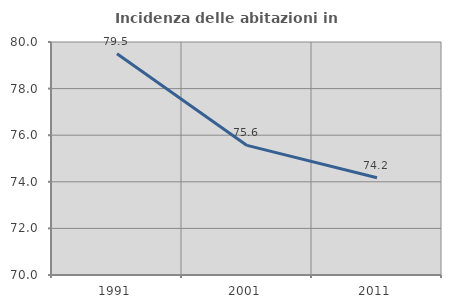
| Category | Incidenza delle abitazioni in proprietà  |
|---|---|
| 1991.0 | 79.499 |
| 2001.0 | 75.562 |
| 2011.0 | 74.171 |